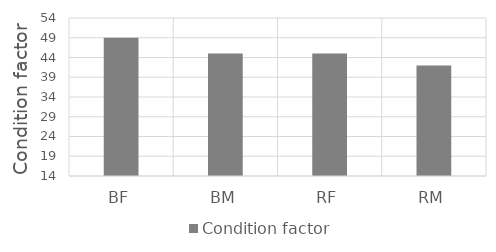
| Category | Condition factor |
|---|---|
| BF | 49 |
| BM | 45 |
| RF | 45 |
| RM | 42 |